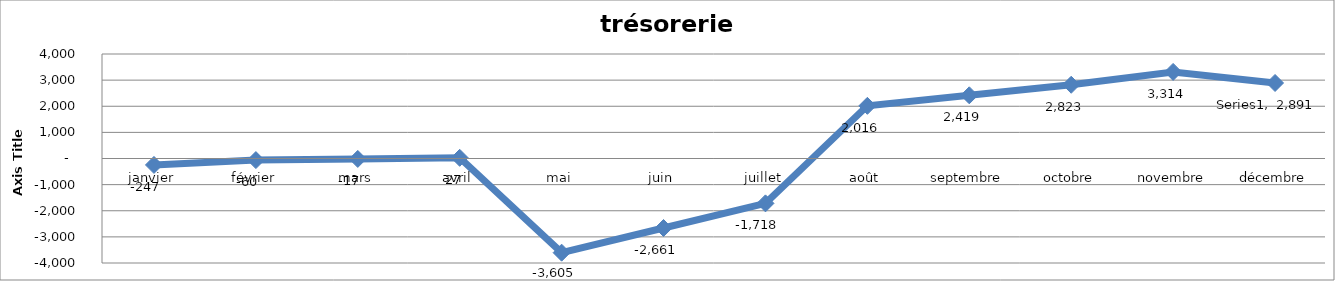
| Category | Series 0 |
|---|---|
| janvier | -246.5 |
| février | -60.47 |
| mars | -16.97 |
| avril | 26.53 |
| mai | -3604.67 |
| juin | -2661.17 |
| juillet | -1717.67 |
| août | 2015.65 |
| septembre | 2419.15 |
| octobre | 2822.65 |
| novembre | 3314.35 |
| décembre | 2891.11 |